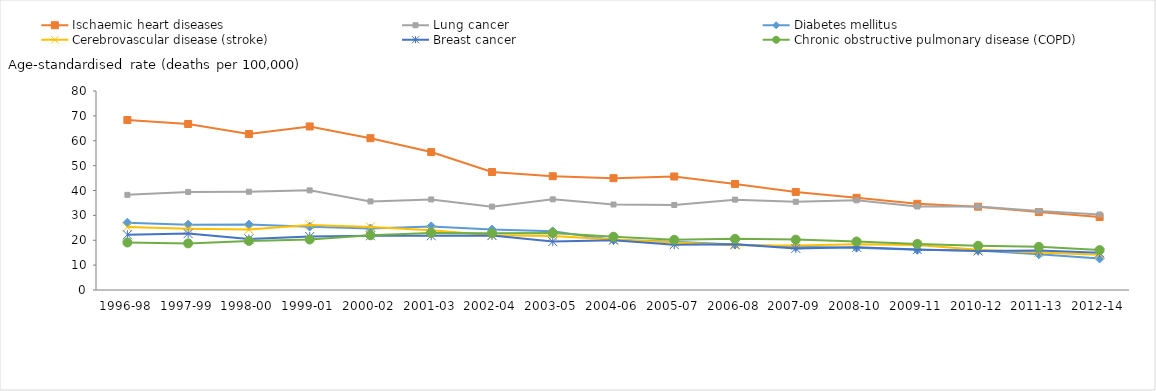
| Category | Ischaemic heart diseases | Lung cancer | Diabetes mellitus | Cerebrovascular disease (stroke) | Breast cancer | Chronic obstructive pulmonary disease (COPD) |
|---|---|---|---|---|---|---|
| 1996-98 | 68.333 | 38.251 | 27.045 | 25.284 | 22.23 | 19.095 |
| 1997-99 | 66.757 | 39.405 | 26.261 | 24.576 | 22.67 | 18.738 |
| 1998-00 | 62.699 | 39.515 | 26.297 | 24.296 | 20.537 | 19.736 |
| 1999-01 | 65.747 | 40.053 | 25.459 | 26.176 | 21.505 | 20.295 |
| 2000-02 | 61.025 | 35.617 | 24.722 | 25.36 | 21.821 | 22.032 |
| 2001-03 | 55.444 | 36.401 | 25.567 | 24.034 | 21.802 | 22.945 |
| 2002-04 | 47.439 | 33.519 | 24.295 | 21.984 | 21.872 | 22.796 |
| 2003-05 | 45.733 | 36.44 | 23.573 | 21.697 | 19.449 | 22.915 |
| 2004-06 | 44.967 | 34.378 | 20.115 | 20.315 | 20.028 | 21.407 |
| 2005-07 | 45.624 | 34.179 | 19.388 | 19.103 | 18.219 | 20.171 |
| 2006-08 | 42.617 | 36.328 | 18.246 | 17.99 | 18.359 | 20.562 |
| 2007-09 | 39.422 | 35.462 | 17.397 | 17.921 | 16.713 | 20.257 |
| 2008-10 | 37.063 | 36.047 | 17.023 | 18.4 | 17.15 | 19.505 |
| 2009-11 | 34.637 | 33.566 | 16.178 | 18.132 | 16.243 | 18.516 |
| 2010-12 | 33.48 | 33.547 | 15.926 | 16.218 | 15.684 | 17.79 |
| 2011-13 | 31.323 | 31.716 | 14.346 | 15.085 | 15.832 | 17.36 |
| 2012-14 | 29.351 | 30.361 | 12.679 | 14.216 | 14.964 | 16.051 |